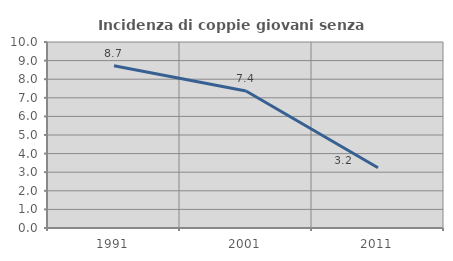
| Category | Incidenza di coppie giovani senza figli |
|---|---|
| 1991.0 | 8.723 |
| 2001.0 | 7.365 |
| 2011.0 | 3.238 |